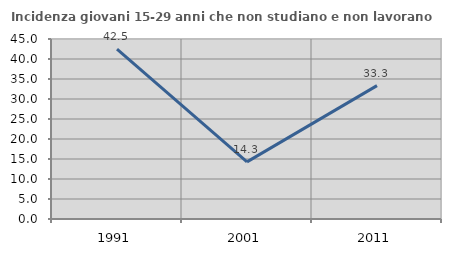
| Category | Incidenza giovani 15-29 anni che non studiano e non lavorano  |
|---|---|
| 1991.0 | 42.469 |
| 2001.0 | 14.286 |
| 2011.0 | 33.333 |